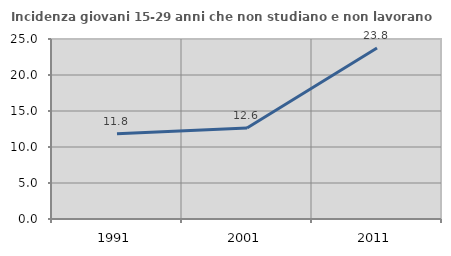
| Category | Incidenza giovani 15-29 anni che non studiano e non lavorano  |
|---|---|
| 1991.0 | 11.835 |
| 2001.0 | 12.629 |
| 2011.0 | 23.754 |